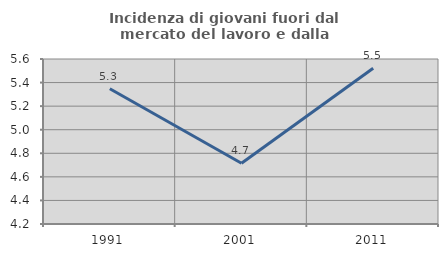
| Category | Incidenza di giovani fuori dal mercato del lavoro e dalla formazione  |
|---|---|
| 1991.0 | 5.348 |
| 2001.0 | 4.715 |
| 2011.0 | 5.521 |